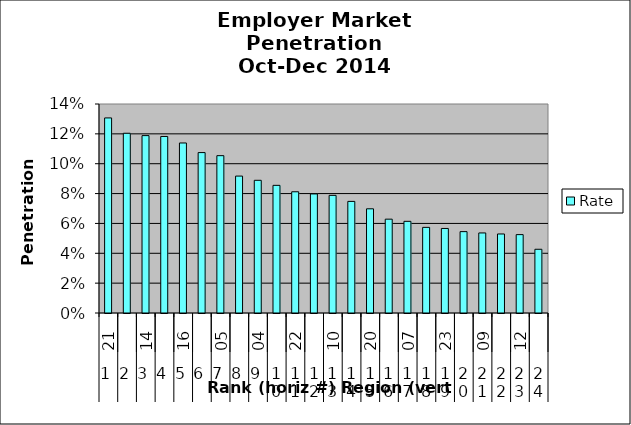
| Category | Rate |
|---|---|
| 0 | 0.131 |
| 1 | 0.12 |
| 2 | 0.119 |
| 3 | 0.118 |
| 4 | 0.114 |
| 5 | 0.107 |
| 6 | 0.105 |
| 7 | 0.092 |
| 8 | 0.089 |
| 9 | 0.086 |
| 10 | 0.081 |
| 11 | 0.08 |
| 12 | 0.079 |
| 13 | 0.075 |
| 14 | 0.07 |
| 15 | 0.063 |
| 16 | 0.061 |
| 17 | 0.057 |
| 18 | 0.057 |
| 19 | 0.055 |
| 20 | 0.054 |
| 21 | 0.053 |
| 22 | 0.053 |
| 23 | 0.043 |